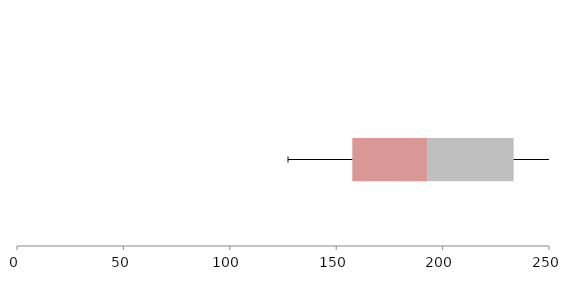
| Category | Series 1 | Series 2 | Series 3 |
|---|---|---|---|
| 0 | 157.58 | 35.411 | 40.394 |